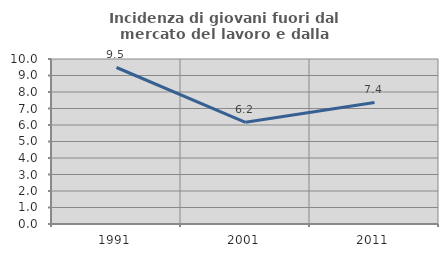
| Category | Incidenza di giovani fuori dal mercato del lavoro e dalla formazione  |
|---|---|
| 1991.0 | 9.485 |
| 2001.0 | 6.162 |
| 2011.0 | 7.364 |